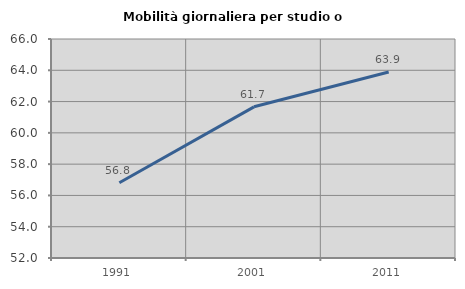
| Category | Mobilità giornaliera per studio o lavoro |
|---|---|
| 1991.0 | 56.809 |
| 2001.0 | 61.665 |
| 2011.0 | 63.894 |